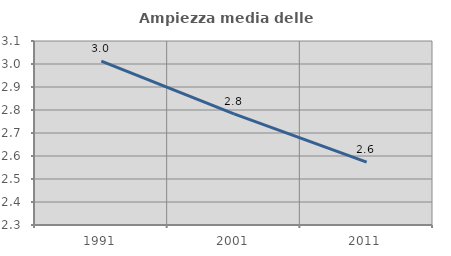
| Category | Ampiezza media delle famiglie |
|---|---|
| 1991.0 | 3.012 |
| 2001.0 | 2.783 |
| 2011.0 | 2.573 |